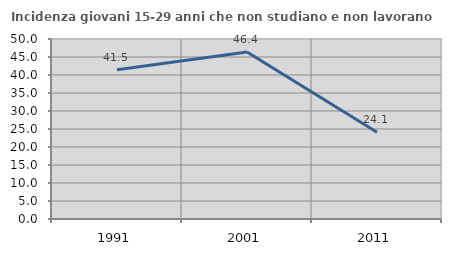
| Category | Incidenza giovani 15-29 anni che non studiano e non lavorano  |
|---|---|
| 1991.0 | 41.463 |
| 2001.0 | 46.407 |
| 2011.0 | 24.125 |